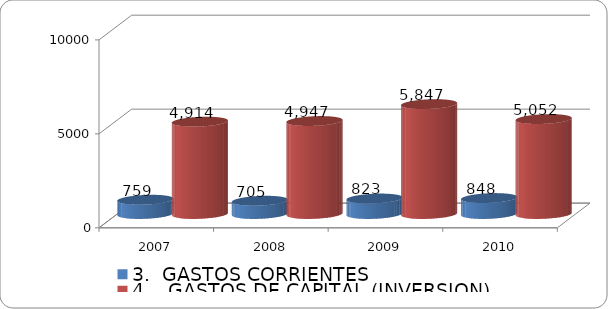
| Category | 3.  GASTOS CORRIENTES | 4.   GASTOS DE CAPITAL (INVERSION) |
|---|---|---|
| 2007 | 759.142 | 4914.029 |
| 2008 | 705.064 | 4947.022 |
| 2009 | 823.297 | 5846.644 |
| 2010 | 848 | 5052 |